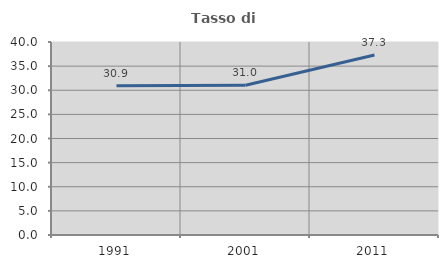
| Category | Tasso di occupazione   |
|---|---|
| 1991.0 | 30.909 |
| 2001.0 | 31.034 |
| 2011.0 | 37.288 |